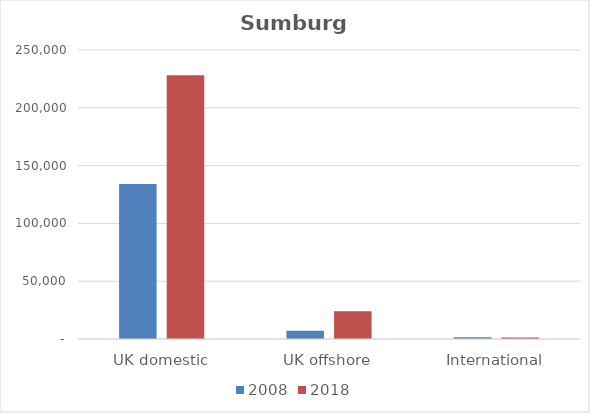
| Category | 2008 | 2018 |
|---|---|---|
| UK domestic | 134127 | 228053 |
| UK offshore | 7076 | 24110 |
| International | 1604 | 1367 |